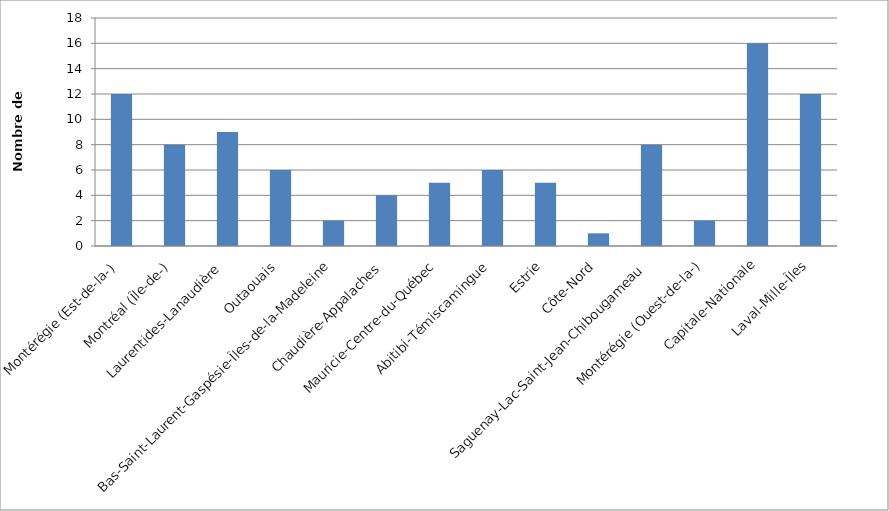
| Category | Total |
|---|---|
| Montérégie (Est-de-la-) | 12 |
| Montréal (Île-de-) | 8 |
| Laurentides-Lanaudière | 9 |
| Outaouais | 6 |
| Bas-Saint-Laurent-Gaspésie-Îles-de-la-Madeleine | 2 |
| Chaudière-Appalaches | 4 |
| Mauricie-Centre-du-Québec | 5 |
| Abitibi-Témiscamingue | 6 |
| Estrie | 5 |
| Côte-Nord | 1 |
| Saguenay-Lac-Saint-Jean-Chibougameau | 8 |
| Montérégie (Ouest-de-la-) | 2 |
| Capitale-Nationale | 16 |
| Laval-Mille-Îles | 12 |